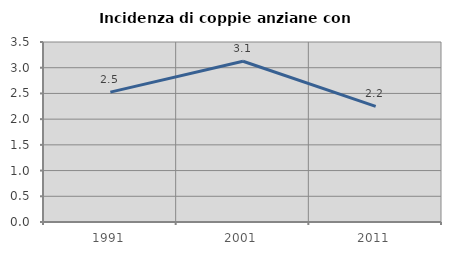
| Category | Incidenza di coppie anziane con figli |
|---|---|
| 1991.0 | 2.525 |
| 2001.0 | 3.125 |
| 2011.0 | 2.247 |